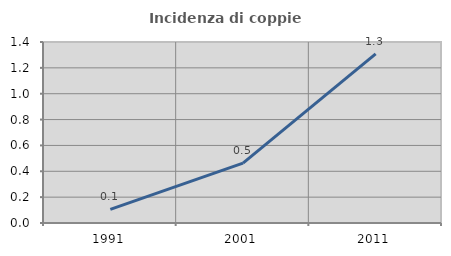
| Category | Incidenza di coppie miste |
|---|---|
| 1991.0 | 0.105 |
| 2001.0 | 0.463 |
| 2011.0 | 1.308 |